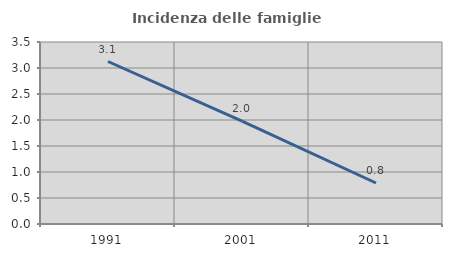
| Category | Incidenza delle famiglie numerose |
|---|---|
| 1991.0 | 3.125 |
| 2001.0 | 1.978 |
| 2011.0 | 0.788 |